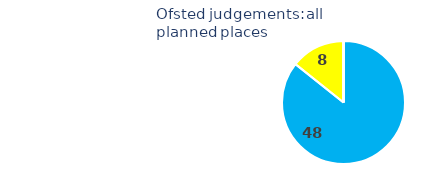
| Category | Series 0 |
|---|---|
| outstanding | 48 |
| good | 8 |
| requires improvement | 0 |
| inadequate | 0 |
| not yet inspected | 0 |
| not inspected by Ofsted | 0 |